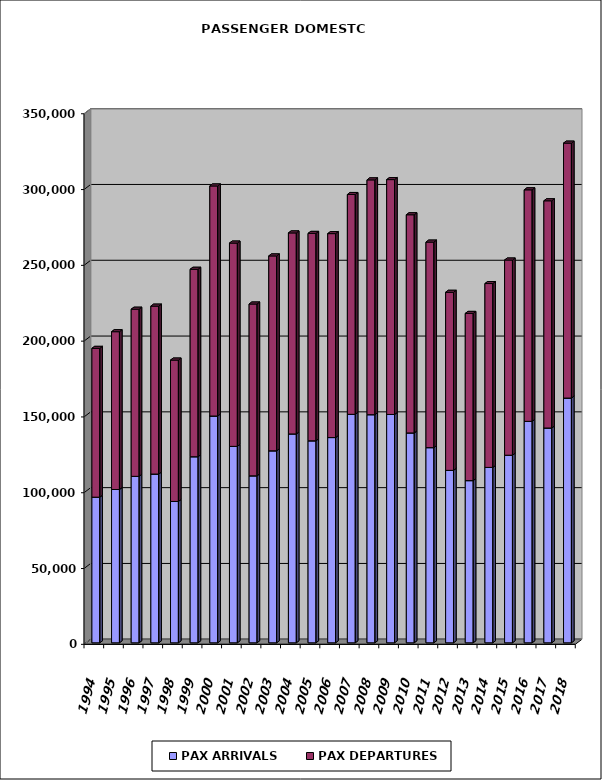
| Category | PAX ARRIVALS | PAX DEPARTURES |
|---|---|---|
| 1994.0 | 96070 | 98165 |
| 1995.0 | 101139 | 104086 |
| 1996.0 | 109810 | 110256 |
| 1997.0 | 111334 | 110761 |
| 1998.0 | 93263 | 93251 |
| 1999.0 | 122752 | 123655 |
| 2000.0 | 149610 | 151755 |
| 2001.0 | 129584 | 134108 |
| 2002.0 | 110141 | 113352 |
| 2003.0 | 126658 | 128561 |
| 2004.0 | 137800 | 132586 |
| 2005.0 | 133256 | 136822 |
| 2006.0 | 135395 | 134532 |
| 2007.0 | 150726 | 145000 |
| 2008.0 | 150484 | 154894 |
| 2009.0 | 150627 | 154927 |
| 2010.0 | 138453 | 143909 |
| 2011.0 | 128746 | 135592 |
| 2012.0 | 113755 | 117460 |
| 2013.0 | 106993 | 110306 |
| 2014.0 | 115701 | 121294 |
| 2015.0 | 123753 | 128753 |
| 2016.0 | 146086 | 152724 |
| 2017.0 | 141707 | 149874 |
| 2018.0 | 161452 | 168168 |